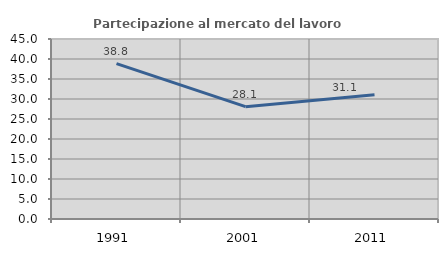
| Category | Partecipazione al mercato del lavoro  femminile |
|---|---|
| 1991.0 | 38.834 |
| 2001.0 | 28.076 |
| 2011.0 | 31.065 |